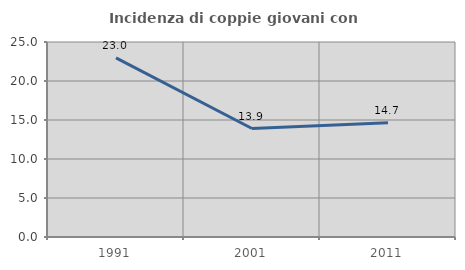
| Category | Incidenza di coppie giovani con figli |
|---|---|
| 1991.0 | 22.971 |
| 2001.0 | 13.905 |
| 2011.0 | 14.661 |